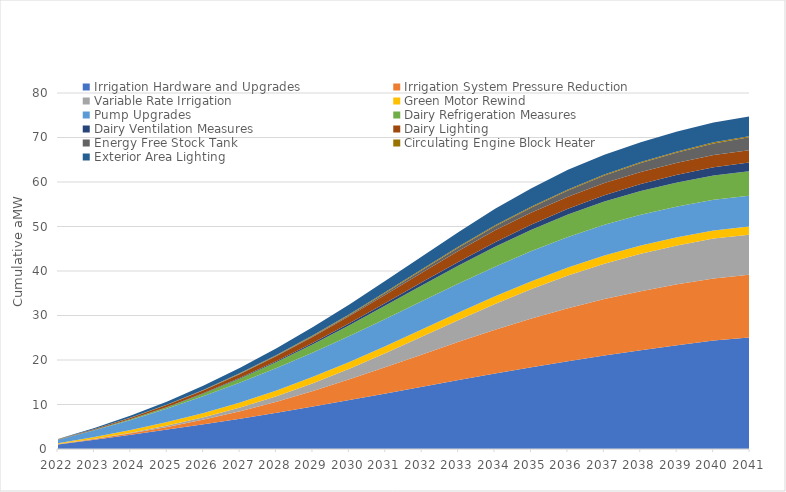
| Category | Irrigation Hardware and Upgrades | Irrigation System Pressure Reduction | Variable Rate Irrigation | Green Motor Rewind | Pump Upgrades | Dairy Refrigeration Measures | Dairy Ventilation Measures | Dairy Lighting | Energy Free Stock Tank | Circulating Engine Block Heater | Exterior Area Lighting |
|---|---|---|---|---|---|---|---|---|---|---|---|
| 2022.0 | 1.036 | 0.051 | 0.024 | 0.196 | 0.755 | 0.026 | 0.006 | 0.06 | 0.001 | 0.01 | 0.09 |
| 2023.0 | 2.103 | 0.142 | 0.073 | 0.393 | 1.513 | 0.067 | 0.02 | 0.163 | 0.004 | 0.023 | 0.243 |
| 2024.0 | 3.208 | 0.312 | 0.16 | 0.59 | 2.273 | 0.151 | 0.043 | 0.297 | 0.01 | 0.038 | 0.439 |
| 2025.0 | 4.355 | 0.6 | 0.3 | 0.789 | 3.039 | 0.302 | 0.077 | 0.458 | 0.021 | 0.055 | 0.669 |
| 2026.0 | 5.558 | 1.044 | 0.512 | 0.988 | 3.803 | 0.541 | 0.123 | 0.644 | 0.041 | 0.076 | 0.929 |
| 2027.0 | 6.824 | 1.669 | 0.814 | 1.167 | 4.489 | 0.882 | 0.183 | 0.853 | 0.071 | 0.099 | 1.215 |
| 2028.0 | 8.154 | 2.486 | 1.221 | 1.309 | 5.037 | 1.325 | 0.26 | 1.082 | 0.116 | 0.125 | 1.523 |
| 2029.0 | 9.549 | 3.49 | 1.746 | 1.424 | 5.475 | 1.851 | 0.352 | 1.329 | 0.18 | 0.151 | 1.849 |
| 2030.0 | 10.997 | 4.652 | 2.39 | 1.515 | 5.826 | 2.428 | 0.459 | 1.593 | 0.267 | 0.176 | 2.191 |
| 2031.0 | 12.487 | 5.932 | 3.149 | 1.589 | 6.108 | 3.016 | 0.58 | 1.872 | 0.381 | 0.198 | 2.547 |
| 2032.0 | 13.992 | 7.269 | 3.994 | 1.647 | 6.332 | 3.574 | 0.71 | 2.165 | 0.525 | 0.214 | 2.913 |
| 2033.0 | 15.485 | 8.597 | 4.886 | 1.694 | 6.512 | 4.07 | 0.848 | 2.469 | 0.7 | 0.225 | 3.289 |
| 2034.0 | 16.946 | 9.853 | 5.776 | 1.732 | 6.655 | 4.485 | 0.99 | 2.715 | 0.906 | 0.232 | 3.671 |
| 2035.0 | 18.356 | 10.981 | 6.611 | 1.762 | 6.771 | 4.812 | 1.134 | 2.715 | 1.143 | 0.235 | 4.058 |
| 2036.0 | 19.706 | 11.939 | 7.347 | 1.787 | 6.864 | 5.054 | 1.278 | 2.715 | 1.406 | 0.235 | 4.449 |
| 2037.0 | 20.986 | 12.709 | 7.956 | 1.806 | 6.94 | 5.222 | 1.423 | 2.715 | 1.69 | 0.235 | 4.466 |
| 2038.0 | 22.19 | 13.287 | 8.423 | 1.806 | 6.94 | 5.335 | 1.568 | 2.715 | 1.991 | 0.235 | 4.466 |
| 2039.0 | 23.321 | 13.682 | 8.747 | 1.807 | 6.94 | 5.407 | 1.714 | 2.715 | 2.303 | 0.235 | 4.466 |
| 2040.0 | 24.392 | 13.934 | 8.955 | 1.807 | 6.94 | 5.45 | 1.859 | 2.715 | 2.622 | 0.235 | 4.466 |
| 2041.0 | 25.063 | 14.1 | 9.033 | 1.807 | 6.94 | 5.476 | 2.004 | 2.715 | 2.943 | 0.235 | 4.466 |